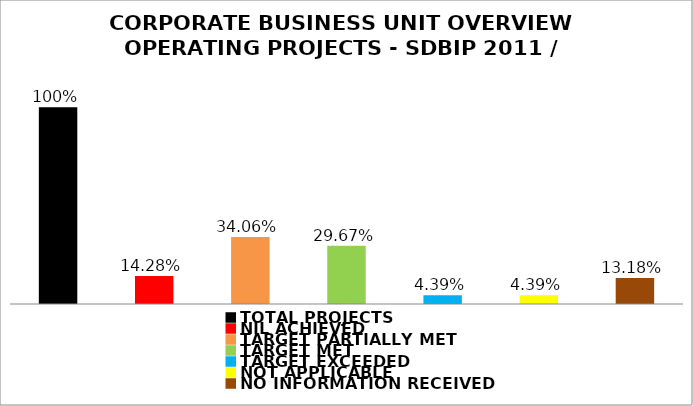
| Category | Series 0 |
|---|---|
| TOTAL PROJECTS | 1 |
| NIL ACHIEVED | 0.143 |
| TARGET PARTIALLY MET | 0.341 |
| TARGET MET | 0.297 |
| TARGET EXCEEDED | 0.044 |
| NOT APPLICABLE | 0.044 |
| NO INFORMATION RECEIVED | 0.132 |